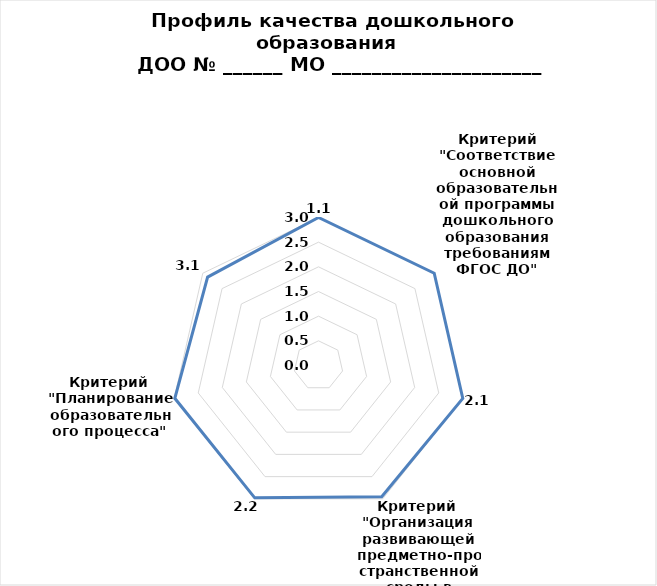
| Category | Series 0 |
|---|---|
| 0 | 3 |
| 1 | 3 |
| 2 | 3 |
| 3 | 2.952 |
| 4 | 2.978 |
| 5 | 2.988 |
| 6 | 2.875 |